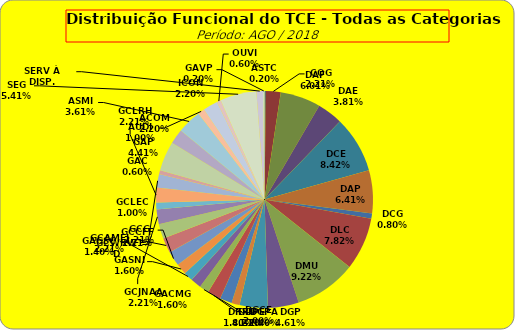
| Category | ASTC |
|---|---|
| ASTC | 1 |
| COG | 11 |
| DAF | 30 |
| DAE | 19 |
| DCE | 42 |
| DAP | 32 |
| DCG | 4 |
| DLC | 39 |
| DMU | 46 |
| DGP | 23 |
| DIN | 21 |
| DPE | 6 |
| DRR | 9 |
| DGCE | 10 |
| DGPA | 7 |
| GACMG | 8 |
| GAGSC | 7 |
| GASNI | 8 |
| GCG | 11 |
| GCAMFJ | 11 |
| GCCFF | 11 |
| GCJNAA | 11 |
| GCLEC | 5 |
| GCLRH | 11 |
| GCWRWD | 10 |
| GAC | 3 |
| GAP | 22 |
| ACOM | 11 |
| ASMI | 18 |
| AUDI | 5 |
| ICON | 11 |
| OUVI | 3 |
| SEG | 27 |
| SERV À DISP. | 5 |
| GAVP | 1 |